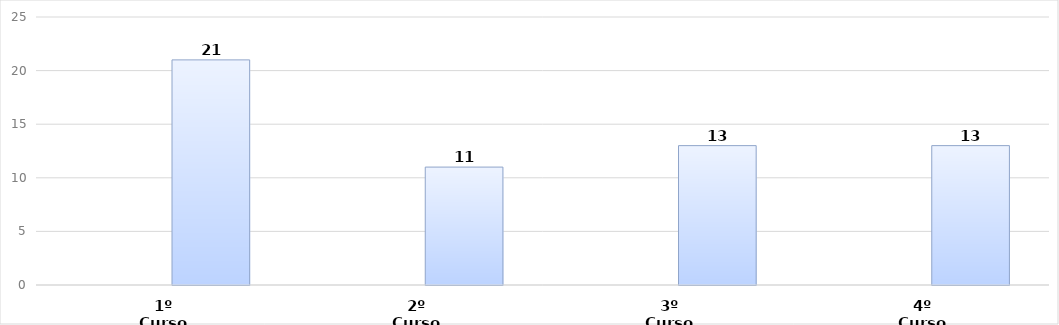
| Category | Series 0 | Series 1 |
|---|---|---|
| 1º Curso |  | 21 |
| 2º Curso |  | 11 |
| 3º Curso |  | 13 |
| 4º Curso |  | 13 |